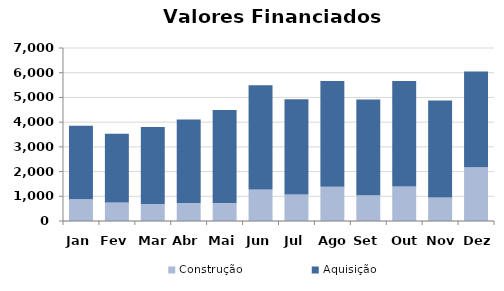
| Category | Construção | Aquisição  |
|---|---|---|
| Jan | 876.95 | 2977.012 |
| Fev | 751.165 | 2780.225 |
| Mar | 687.503 | 3115.648 |
| Abr | 732.201 | 3377.408 |
| Mai | 725.786 | 3769.635 |
| Jun | 1276.332 | 4217.638 |
| Jul | 1069.459 | 3857.308 |
| Ago | 1381.119 | 4286.052 |
| Set | 1045.098 | 3868.675 |
| Out | 1392.434 | 4269.782 |
| Nov | 952.097 | 3924.073 |
| Dez | 2171.394 | 3882.25 |